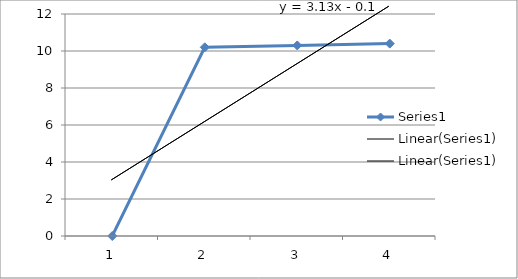
| Category | Series 0 |
|---|---|
| 0 | 0 |
| 1 | 10.2 |
| 2 | 10.3 |
| 3 | 10.4 |